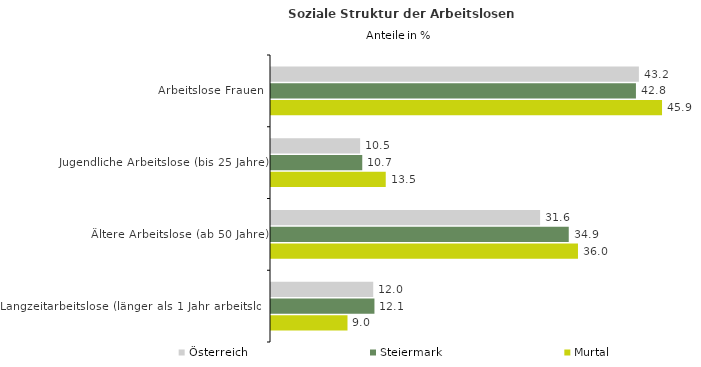
| Category | Österreich | Steiermark | Murtal |
|---|---|---|---|
| Arbeitslose Frauen | 43.18 | 42.833 | 45.895 |
| Jugendliche Arbeitslose (bis 25 Jahre) | 10.46 | 10.711 | 13.467 |
| Ältere Arbeitslose (ab 50 Jahre) | 31.584 | 34.947 | 36.031 |
| Langzeitarbeitslose (länger als 1 Jahr arbeitslos) | 11.999 | 12.142 | 8.978 |